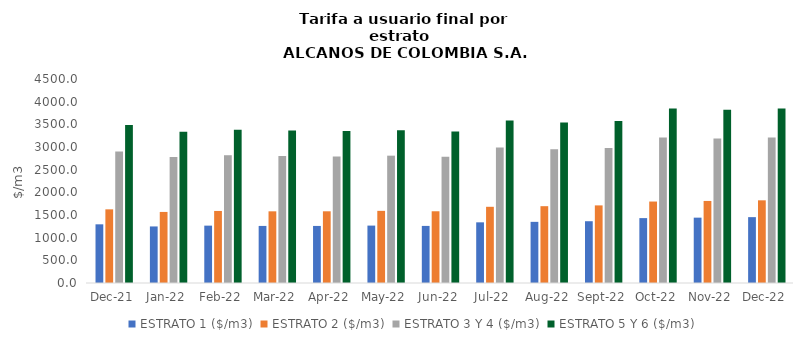
| Category | ESTRATO 1 ($/m3) | ESTRATO 2 ($/m3) | ESTRATO 3 Y 4 ($/m3) | ESTRATO 5 Y 6 ($/m3) |
|---|---|---|---|---|
| 2021-12-01 | 1294.42 | 1624.99 | 2902.39 | 3482.868 |
| 2022-01-01 | 1247.63 | 1567.63 | 2778.76 | 3334.512 |
| 2022-02-01 | 1265.36 | 1589.21 | 2818.77 | 3382.524 |
| 2022-03-01 | 1258.99 | 1581.08 | 2801.57 | 3361.884 |
| 2022-04-01 | 1258.78 | 1581.81 | 2791.83 | 3350.196 |
| 2022-05-01 | 1266.29 | 1591.45 | 2808.77 | 3370.524 |
| 2022-06-01 | 1259.34 | 1582.32 | 2787.21 | 3344.652 |
| 2022-07-01 | 1338.24 | 1681.01 | 2986.65 | 3583.98 |
| 2022-08-01 | 1348.94 | 1694.58 | 2951.9 | 3542.28 |
| 2022-09-01 | 1362.74 | 1711.93 | 2979.32 | 3575.184 |
| 2022-10-01 | 1431.37 | 1796.98 | 3208.12 | 3849.744 |
| 2022-11-01 | 1441.49 | 1809.92 | 3185.9 | 3823.08 |
| 2022-12-01 | 1452.83 | 1823.71 | 3209.93 | 3851.916 |